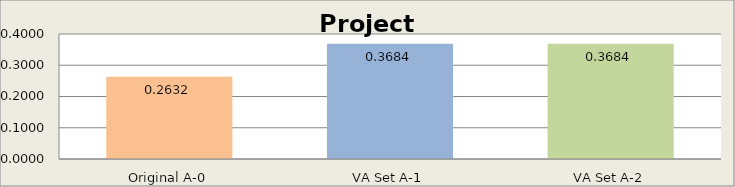
| Category | Schedule Module |
|---|---|
| Original A-0 | 0.263 |
| VA Set A-1 | 0.368 |
| VA Set A-2 | 0.368 |